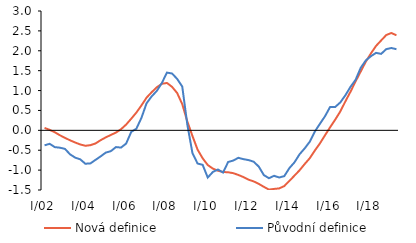
| Category | Nová definice | Původní definice |
|---|---|---|
| I/02 | 0.061 | -0.377 |
| II | 0.013 | -0.338 |
| III | -0.048 | -0.422 |
| IV | -0.123 | -0.436 |
| I/03 | -0.188 | -0.466 |
| II | -0.251 | -0.603 |
| III | -0.306 | -0.686 |
| IV | -0.355 | -0.73 |
| I/04 | -0.388 | -0.84 |
| II | -0.372 | -0.831 |
| III | -0.329 | -0.742 |
| IV | -0.247 | -0.655 |
| I/05 | -0.178 | -0.56 |
| II | -0.116 | -0.523 |
| III | -0.056 | -0.421 |
| IV | 0.028 | -0.434 |
| I/06 | 0.145 | -0.332 |
| II | 0.292 | -0.039 |
| III | 0.446 | 0.04 |
| IV | 0.626 | 0.314 |
| I/07 | 0.821 | 0.68 |
| II | 0.958 | 0.853 |
| III | 1.082 | 0.989 |
| IV | 1.169 | 1.19 |
| I/08 | 1.191 | 1.451 |
| II | 1.093 | 1.429 |
| III | 0.938 | 1.293 |
| IV | 0.658 | 1.101 |
| I/09 | 0.221 | 0.141 |
| II | -0.142 | -0.572 |
| III | -0.483 | -0.834 |
| IV | -0.703 | -0.868 |
| I/10 | -0.872 | -1.186 |
| II | -0.962 | -1.047 |
| III | -1.015 | -0.985 |
| IV | -1.047 | -1.061 |
| I/11 | -1.054 | -0.796 |
| II | -1.077 | -0.76 |
| III | -1.121 | -0.691 |
| IV | -1.175 | -0.725 |
| I/12 | -1.241 | -0.748 |
| II | -1.284 | -0.788 |
| III | -1.346 | -0.911 |
| IV | -1.42 | -1.125 |
| I/13 | -1.49 | -1.204 |
| II | -1.473 | -1.143 |
| III | -1.46 | -1.185 |
| IV | -1.402 | -1.152 |
| I/14 | -1.272 | -0.951 |
| II | -1.139 | -0.805 |
| III | -1.004 | -0.602 |
| IV | -0.848 | -0.455 |
| I/15 | -0.702 | -0.287 |
| II | -0.507 | -0.029 |
| III | -0.328 | 0.165 |
| IV | -0.123 | 0.356 |
| I/16 | 0.078 | 0.59 |
| II | 0.271 | 0.588 |
| III | 0.476 | 0.703 |
| IV | 0.731 | 0.884 |
| I/17 | 0.974 | 1.095 |
| II | 1.234 | 1.272 |
| III | 1.481 | 1.574 |
| IV | 1.729 | 1.758 |
| I/18 | 1.934 | 1.864 |
| II | 2.122 | 1.947 |
| III | 2.26 | 1.922 |
| IV | 2.396 | 2.041 |
| I/19 | 2.447 | 2.07 |
| II | 2.39 | 2.04 |